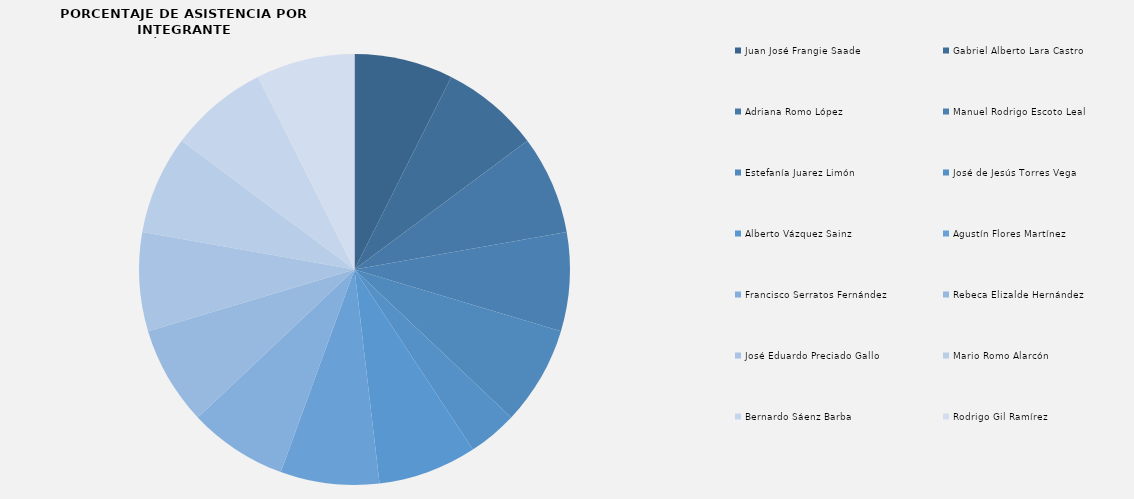
| Category | Series 0 |
|---|---|
| Juan José Frangie Saade | 2 |
| Gabriel Alberto Lara Castro | 2 |
| Adriana Romo López | 2 |
| Manuel Rodrigo Escoto Leal | 2 |
| Estefanía Juarez Limón | 2 |
| José de Jesús Torres Vega | 1 |
| Alberto Vázquez Sainz | 2 |
| Agustín Flores Martínez | 2 |
| Francisco Serratos Fernández | 2 |
| Rebeca Elizalde Hernández | 2 |
| José Eduardo Preciado Gallo | 2 |
| Mario Romo Alarcón | 2 |
| Bernardo Sáenz Barba | 2 |
| Rodrigo Gil Ramírez | 2 |